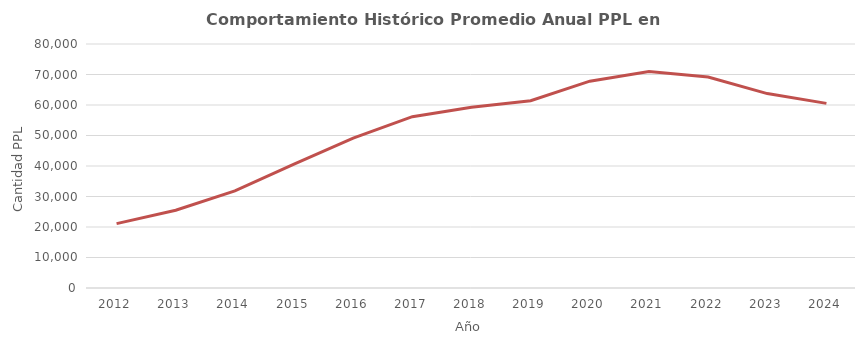
| Category | Promedio anual Domiciliaria |
|---|---|
| 2012.0 | 21098.25 |
| 2013.0 | 25499.083 |
| 2014.0 | 31836.75 |
| 2015.0 | 40614.5 |
| 2016.0 | 49161.167 |
| 2017.0 | 56180.75 |
| 2018.0 | 59289.25 |
| 2019.0 | 61380.5 |
| 2020.0 | 67811 |
| 2021.0 | 70980.5 |
| 2022.0 | 69173.833 |
| 2023.0 | 63744.25 |
| 2024.0 | 60532.8 |